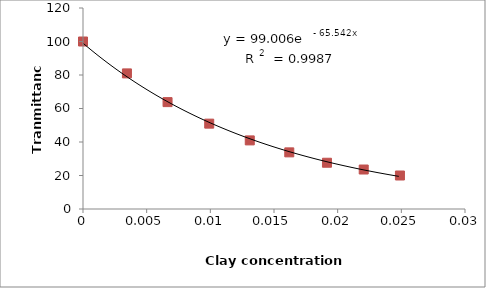
| Category | Series 1 |
|---|---|
| 0.0 | 100 |
| 0.0034516765285996054 | 80.952 |
| 0.006640244750382423 | 63.81 |
| 0.009912196460419812 | 50.952 |
| 0.013097333152836064 | 40.952 |
| 0.016199064796259186 | 33.81 |
| 0.019159741458910435 | 27.619 |
| 0.022046372280838868 | 23.571 |
| 0.024890661178286595 | 20 |